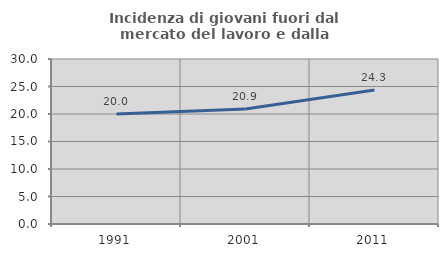
| Category | Incidenza di giovani fuori dal mercato del lavoro e dalla formazione  |
|---|---|
| 1991.0 | 19.993 |
| 2001.0 | 20.91 |
| 2011.0 | 24.349 |